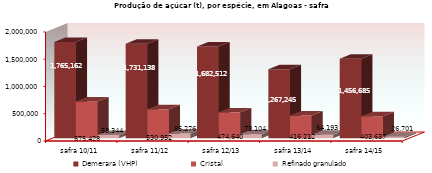
| Category | Demerara (VHP) | Cristal | Refinado granulado |
|---|---|---|---|
| safra 10/11 | 1765162 | 675428 | 58344 |
| safra 11/12 | 1731138 | 530952 | 85276 |
| safra 12/13 | 1682512 | 474640 | 73104 |
| safra 13/14 | 1267245 | 416212 | 64193 |
| safra 14/15 | 1456685 | 403637 | 26701 |